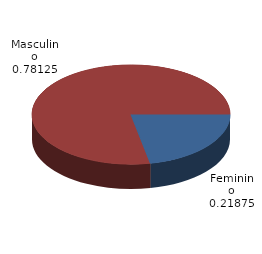
| Category | Qtde Vítimas |
|---|---|
| Feminino | 434 |
| Masculino | 1550 |